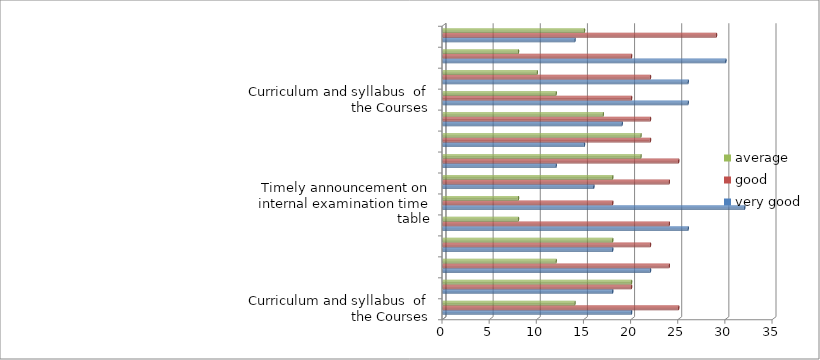
| Category | very good | good | average |
|---|---|---|---|
| Curriculum and syllabus  of the Courses | 20 | 25 | 14 |
| Extent of syllabus covered in the class | 18 | 20 | 20 |
| Courses delivery by faculty members in the class | 22 | 24 | 12 |
| Usage of teaching aids and ICT in the class | 18 | 22 | 18 |
| Fairness in the assessment Process | 26 | 24 | 8 |
| Timely announcement on internal examination time table | 32 | 18 | 8 |
| Opportunities available in the college for best practices/ other activities | 16 | 24 | 18 |
| Opportunities available in the college for students to participate in internship, field visits etc. | 12 | 25 | 21 |
| Opportunities for out of class room learning eg. Guest lectures, Seminars, Workshop Value aided Programmes, Conferences, competitions etc. | 15 | 22 | 21 |
| Overall Learning Experience | 19 | 22 | 17 |
| Curriculum and syllabus  of the Courses | 26 | 20 | 12 |
| Extent of syllabus covered in the class | 26 | 22 | 10 |
| Courses delivery by faculty members in the class | 30 | 20 | 8 |
| Usage of teaching aids and ICT in the class | 14 | 29 | 15 |